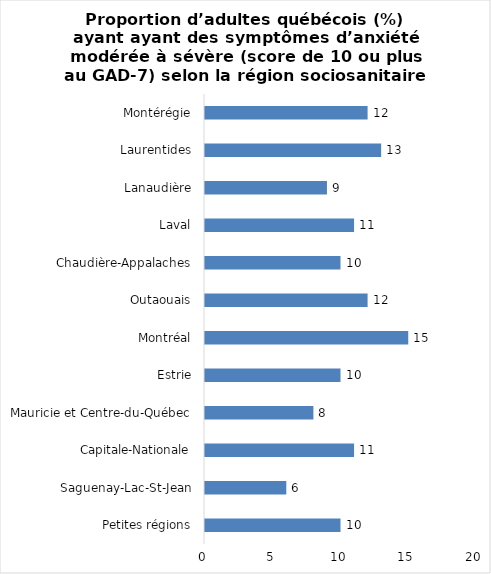
| Category | Series 0 |
|---|---|
| Petites régions | 10 |
| Saguenay-Lac-St-Jean | 6 |
| Capitale-Nationale | 11 |
| Mauricie et Centre-du-Québec | 8 |
| Estrie | 10 |
| Montréal | 15 |
| Outaouais | 12 |
| Chaudière-Appalaches | 10 |
| Laval | 11 |
| Lanaudière | 9 |
| Laurentides | 13 |
| Montérégie | 12 |